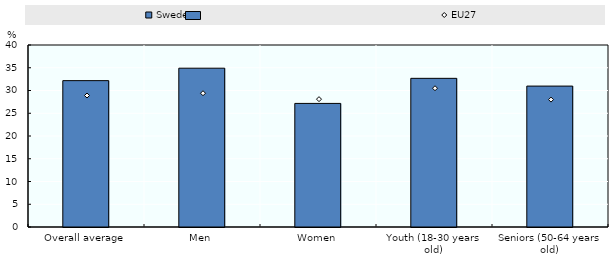
| Category | Sweden |
|---|---|
| Overall average | 32.167 |
| Men | 34.904 |
| Women | 27.161 |
| Youth (18-30 years old) | 32.674 |
| Seniors (50-64 years old) | 30.969 |